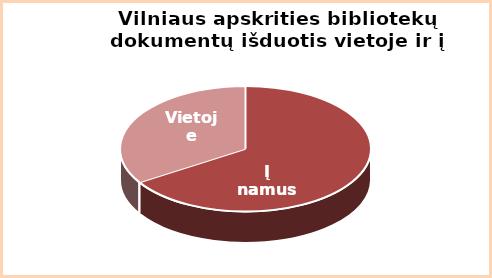
| Category | Series 0 |
|---|---|
|  į namus | 0.66 |
|  vietoje | 0.34 |